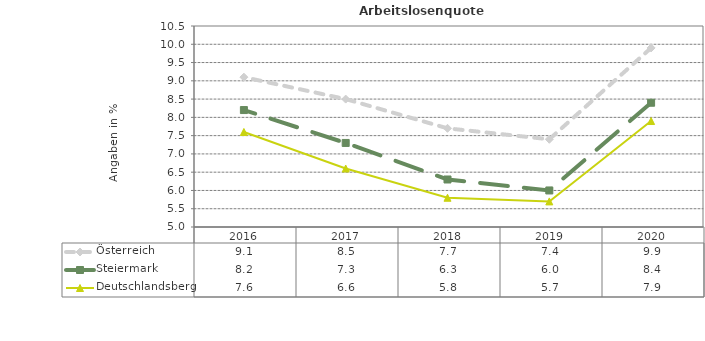
| Category | Österreich | Steiermark | Deutschlandsberg |
|---|---|---|---|
| 2020.0 | 9.9 | 8.4 | 7.9 |
| 2019.0 | 7.4 | 6 | 5.7 |
| 2018.0 | 7.7 | 6.3 | 5.8 |
| 2017.0 | 8.5 | 7.3 | 6.6 |
| 2016.0 | 9.1 | 8.2 | 7.6 |